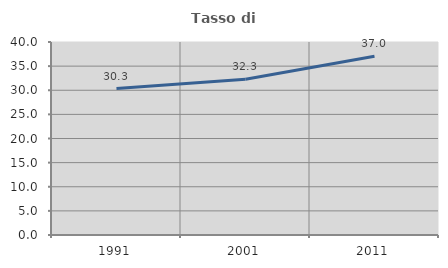
| Category | Tasso di occupazione   |
|---|---|
| 1991.0 | 30.341 |
| 2001.0 | 32.287 |
| 2011.0 | 37.033 |